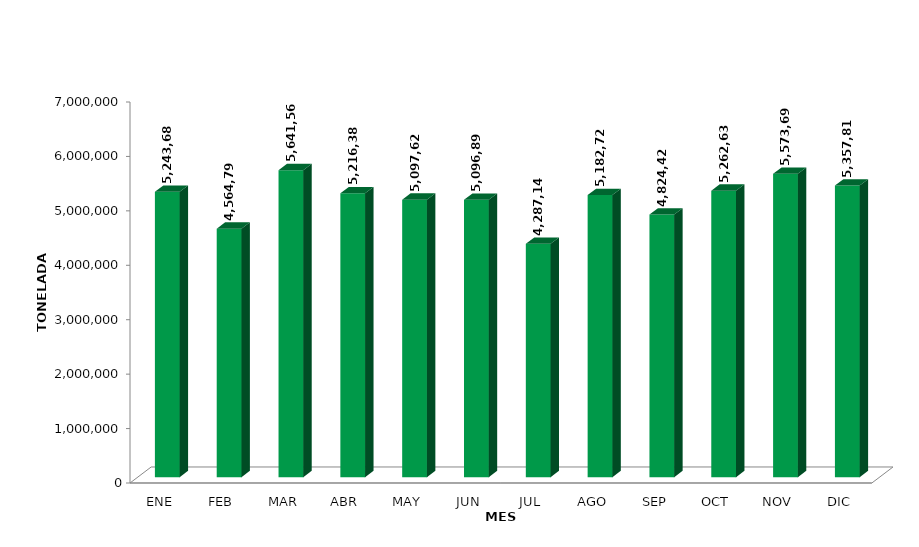
| Category | Series 0 |
|---|---|
| ENE | 5243680.596 |
| FEB | 4564794.601 |
| MAR | 5641565.648 |
| ABR | 5216383.888 |
| MAY | 5097626.359 |
| JUN | 5096896.258 |
| JUL | 4287147.461 |
| AGO | 5182720.642 |
| SEP | 4824425.49 |
| OCT | 5262638.674 |
| NOV | 5573694.429 |
| DIC | 5357811.419 |